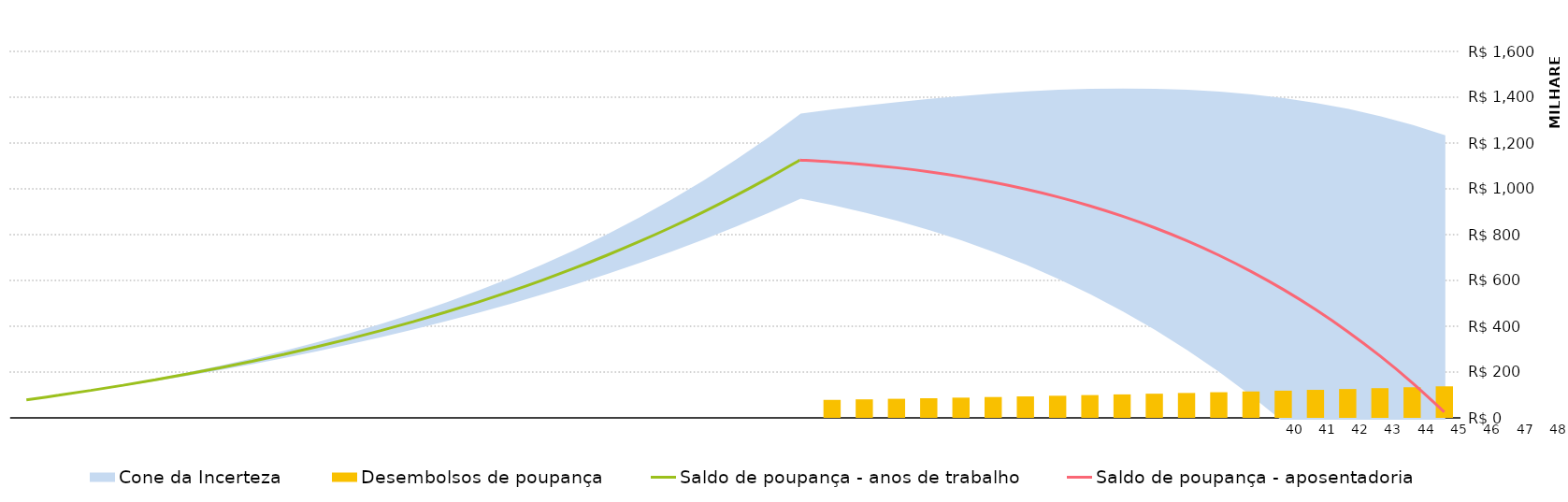
| Category | Desembolsos de poupança |
|---|---|
| 0 | 0 |
| 1 | 0 |
| 2 | 0 |
| 3 | 0 |
| 4 | 0 |
| 5 | 0 |
| 6 | 0 |
| 7 | 0 |
| 8 | 0 |
| 9 | 0 |
| 10 | 0 |
| 11 | 0 |
| 12 | 0 |
| 13 | 0 |
| 14 | 0 |
| 15 | 0 |
| 16 | 0 |
| 17 | 0 |
| 18 | 0 |
| 19 | 0 |
| 20 | 0 |
| 21 | 0 |
| 22 | 0 |
| 23 | 0 |
| 24 | 0 |
| 25 | 78516.672 |
| 26 | 80872.173 |
| 27 | 83298.338 |
| 28 | 85797.288 |
| 29 | 88371.206 |
| 30 | 91022.343 |
| 31 | 93753.013 |
| 32 | 96565.603 |
| 33 | 99462.571 |
| 34 | 102446.449 |
| 35 | 105519.842 |
| 36 | 108685.437 |
| 37 | 111946 |
| 38 | 115304.38 |
| 39 | 118763.512 |
| 40 | 122326.417 |
| 41 | 125996.21 |
| 42 | 129776.096 |
| 43 | 133669.379 |
| 44 | 137679.46 |